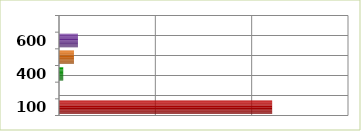
| Category | Series 0 |
|---|---|
| 100.0 | 4425100 |
| 200.0 | 0 |
| 400.0 | 87772 |
| 500.0 | 310336 |
| 600.0 | 393120 |
| 700.0 | 0 |